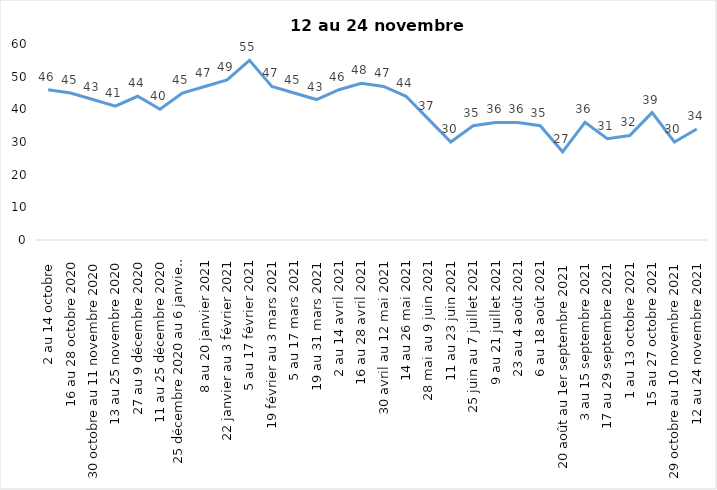
| Category | Toujours aux trois mesures |
|---|---|
| 2 au 14 octobre  | 46 |
| 16 au 28 octobre 2020 | 45 |
| 30 octobre au 11 novembre 2020 | 43 |
| 13 au 25 novembre 2020 | 41 |
| 27 au 9 décembre 2020 | 44 |
| 11 au 25 décembre 2020 | 40 |
| 25 décembre 2020 au 6 janvier 2021 | 45 |
| 8 au 20 janvier 2021 | 47 |
| 22 janvier au 3 février 2021 | 49 |
| 5 au 17 février 2021 | 55 |
| 19 février au 3 mars 2021 | 47 |
| 5 au 17 mars 2021 | 45 |
| 19 au 31 mars 2021 | 43 |
| 2 au 14 avril 2021 | 46 |
| 16 au 28 avril 2021 | 48 |
| 30 avril au 12 mai 2021 | 47 |
| 14 au 26 mai 2021 | 44 |
| 28 mai au 9 juin 2021 | 37 |
| 11 au 23 juin 2021 | 30 |
| 25 juin au 7 juillet 2021 | 35 |
| 9 au 21 juillet 2021 | 36 |
| 23 au 4 août 2021 | 36 |
| 6 au 18 août 2021 | 35 |
| 20 août au 1er septembre 2021 | 27 |
| 3 au 15 septembre 2021 | 36 |
| 17 au 29 septembre 2021 | 31 |
| 1 au 13 octobre 2021 | 32 |
| 15 au 27 octobre 2021 | 39 |
| 29 octobre au 10 novembre 2021 | 30 |
| 12 au 24 novembre 2021 | 34 |